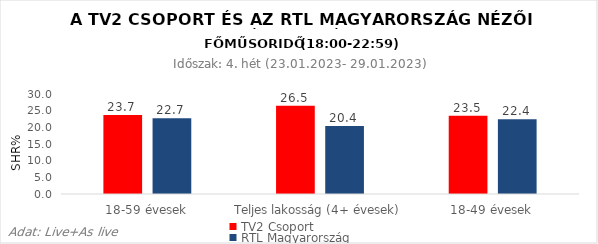
| Category | TV2 Csoport | RTL Magyarország |
|---|---|---|
| 18-59 évesek | 23.7 | 22.7 |
| Teljes lakosság (4+ évesek) | 26.5 | 20.4 |
| 18-49 évesek | 23.5 | 22.4 |